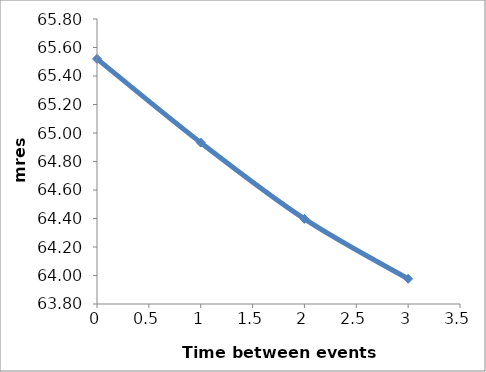
| Category | Series 0 |
|---|---|
| 0.0 | 65.521 |
| 1.0 | 64.932 |
| 2.0 | 64.398 |
| 3.0 | 63.977 |